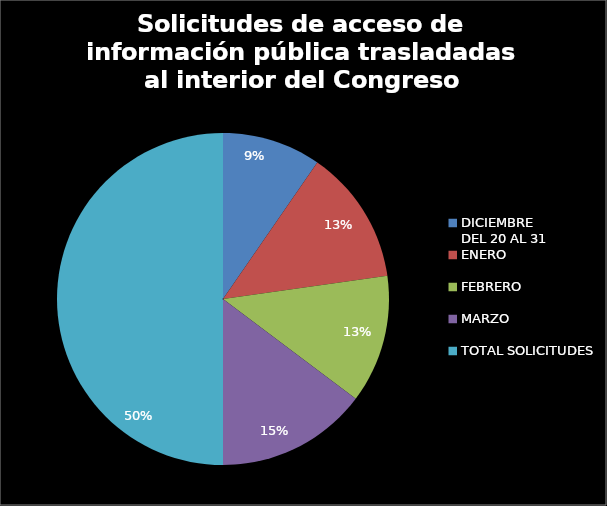
| Category | Solicitudes de acceso de información pública trasladadas al interior del Congreso |
|---|---|
| DICIEMBRE 
DEL 20 AL 31 | 30 |
| ENERO | 41 |
| FEBRERO | 39 |
| MARZO | 46 |
| TOTAL SOLICITUDES | 156 |